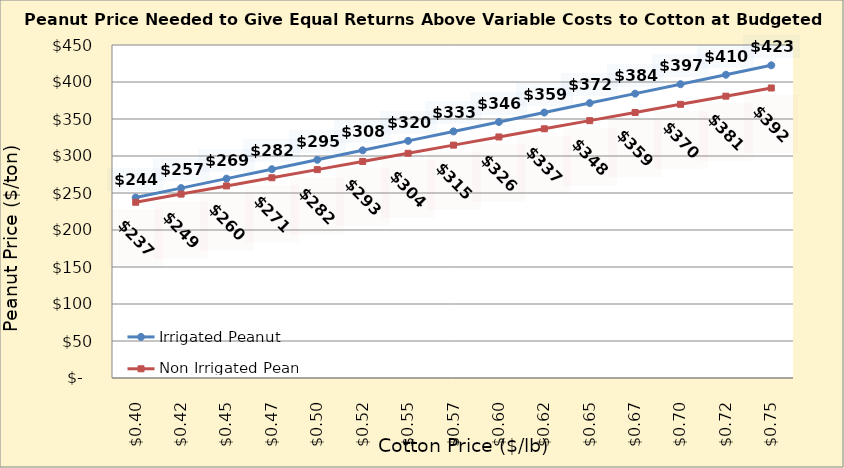
| Category | Irrigated Peanut | Non Irrigated Peanut |
|---|---|---|
| 0.3949999999999998 | 243.856 | 237.484 |
| 0.4199999999999998 | 256.622 | 248.513 |
| 0.44499999999999984 | 269.388 | 259.543 |
| 0.46999999999999986 | 282.154 | 270.572 |
| 0.4949999999999999 | 294.92 | 281.602 |
| 0.5199999999999999 | 307.686 | 292.631 |
| 0.5449999999999999 | 320.452 | 303.66 |
| 0.57 | 333.218 | 314.69 |
| 0.595 | 345.984 | 325.719 |
| 0.62 | 358.75 | 336.749 |
| 0.645 | 371.516 | 347.778 |
| 0.67 | 384.282 | 358.807 |
| 0.6950000000000001 | 397.048 | 369.837 |
| 0.7200000000000001 | 409.814 | 380.866 |
| 0.7450000000000001 | 422.579 | 391.896 |